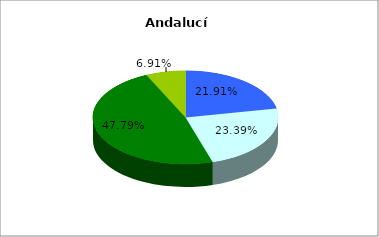
| Category | Andalucía |
|---|---|
| Siempre o casi siempre | 847155 |
| A veces | 904070 |
| Nunca o casi nunca | 1847734 |
| No aplicable | 267019 |